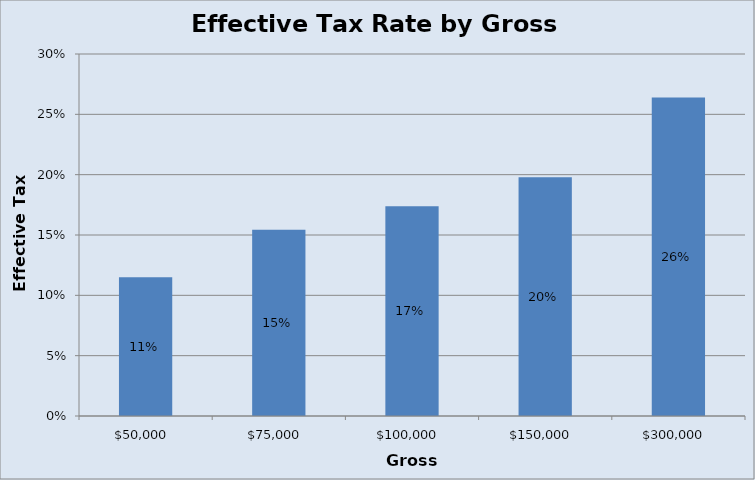
| Category | Effective Tax Rate |
|---|---|
| 50000.0 | 0.115 |
| 75000.0 | 0.154 |
| 100000.0 | 0.174 |
| 150000.0 | 0.198 |
| 300000.0 | 0.264 |